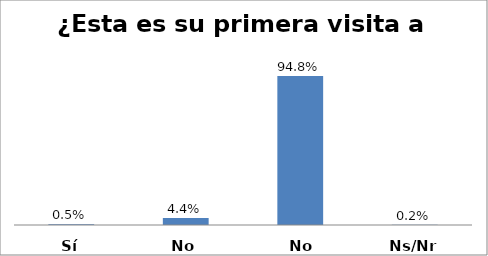
| Category | Series 0 |
|---|---|
| Sí | 0.005 |
| No | 0.044 |
| No aplica | 0.948 |
| Ns/Nr | 0.002 |